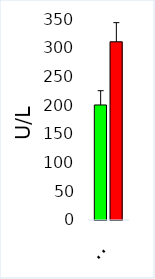
| Category | Control | ASD |
|---|---|---|
| LDH | 200.287 | 310.331 |